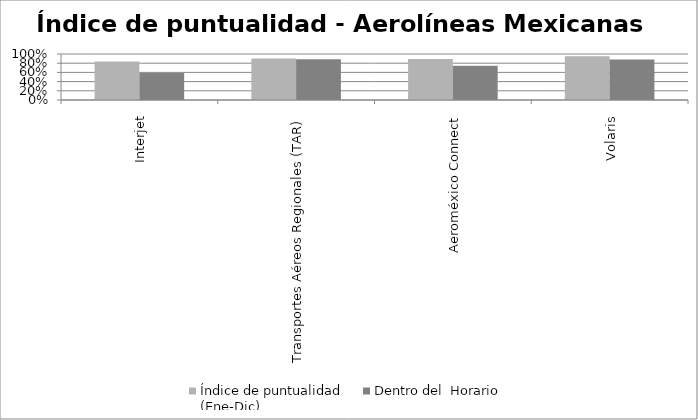
| Category | Índice de puntualidad
(Ene-Dic) | Dentro del  Horario |
|---|---|---|
| Interjet | 0.837 | 0.587 |
| Transportes Aéreos Regionales (TAR) | 0.903 | 0.884 |
| Aeroméxico Connect | 0.892 | 0.745 |
| Volaris | 0.953 | 0.878 |